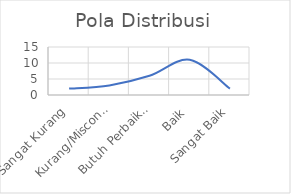
| Category | Pola Distribusi |
|---|---|
| Sangat Kurang | 2 |
| Kurang/Misconduct | 3 |
| Butuh Perbaikan | 6 |
| Baik | 11 |
| Sangat Baik | 2 |